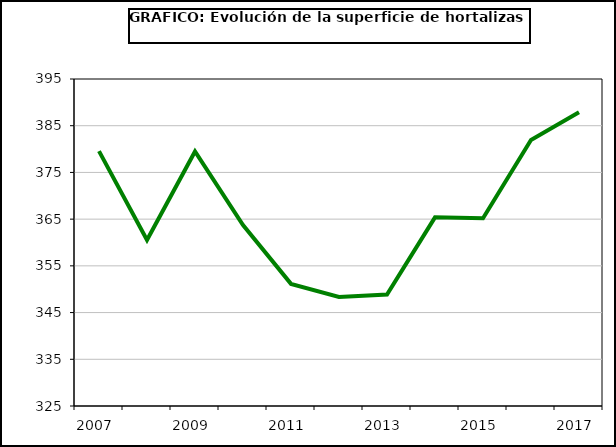
| Category | superficie |
|---|---|
| 2007.0 | 379.564 |
| 2008.0 | 360.539 |
| 2009.0 | 379.479 |
| 2010.0 | 363.729 |
| 2011.0 | 351.145 |
| 2012.0 | 348.359 |
| 2013.0 | 348.853 |
| 2014.0 | 365.385 |
| 2015.0 | 365.178 |
| 2016.0 | 381.94 |
| 2017.0 | 387.895 |